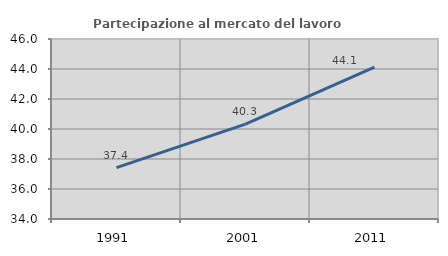
| Category | Partecipazione al mercato del lavoro  femminile |
|---|---|
| 1991.0 | 37.427 |
| 2001.0 | 40.32 |
| 2011.0 | 44.13 |